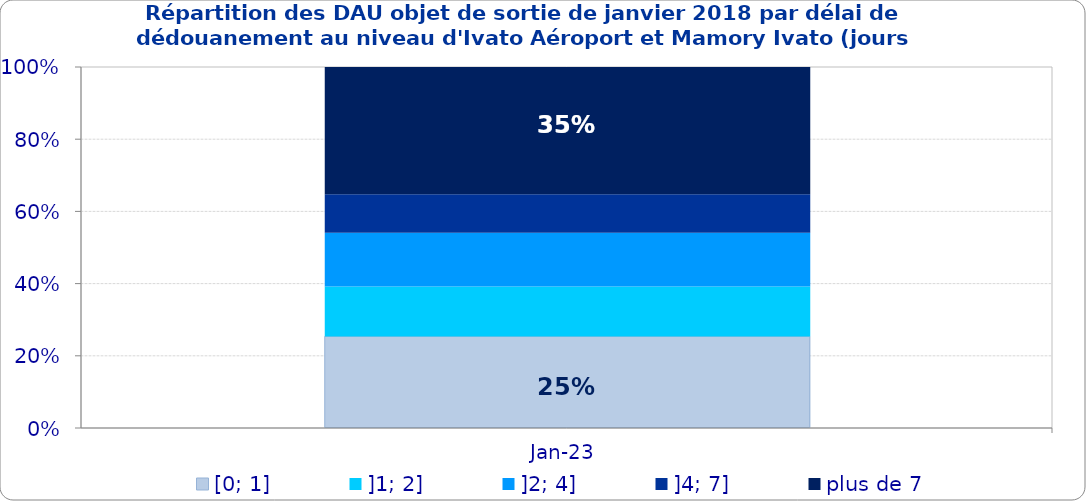
| Category | [0; 1] | ]1; 2] | ]2; 4] | ]4; 7] | plus de 7 |
|---|---|---|---|---|---|
| 2023-01-01 | 0.254 | 0.138 | 0.149 | 0.106 | 0.353 |